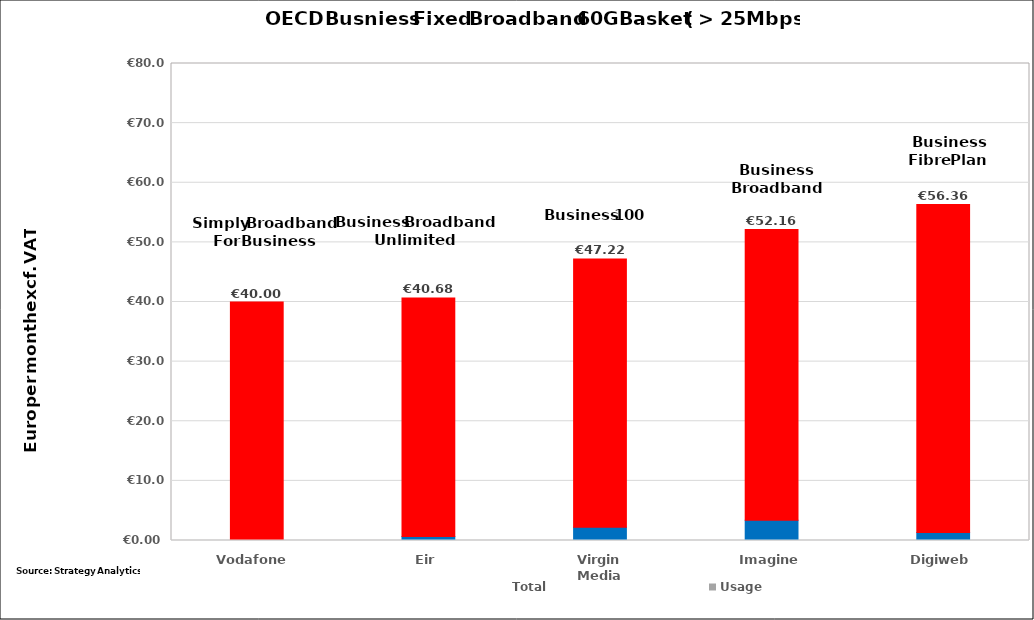
| Category | Non-rec | Monthly | Usage | Total |
|---|---|---|---|---|
| Vodafone  | 0 | 40 | 0 | 40 |
| Eir | 0.686 | 39.99 | 0 | 40.676 |
| Virgin Media | 2.222 | 45 | 0 | 47.222 |
| Imagine | 3.388 | 48.77 | 0 | 52.158 |
| Digiweb | 1.361 | 55 | 0 | 56.361 |